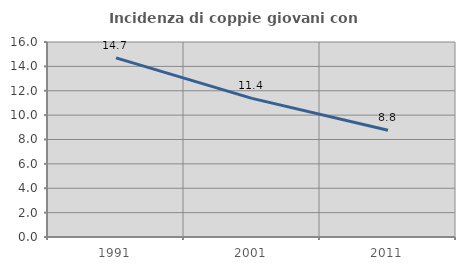
| Category | Incidenza di coppie giovani con figli |
|---|---|
| 1991.0 | 14.701 |
| 2001.0 | 11.375 |
| 2011.0 | 8.761 |